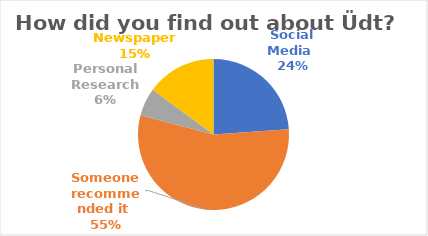
| Category | Number  |
|---|---|
| Social Media  | 16 |
| Someone recommended it  | 37 |
| Personal Research  | 4 |
| Newspaper  | 10 |